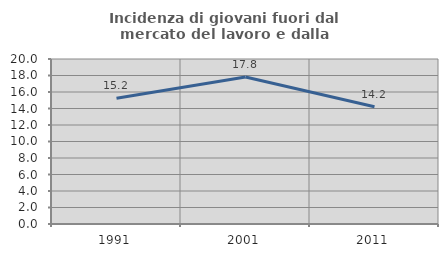
| Category | Incidenza di giovani fuori dal mercato del lavoro e dalla formazione  |
|---|---|
| 1991.0 | 15.231 |
| 2001.0 | 17.815 |
| 2011.0 | 14.21 |